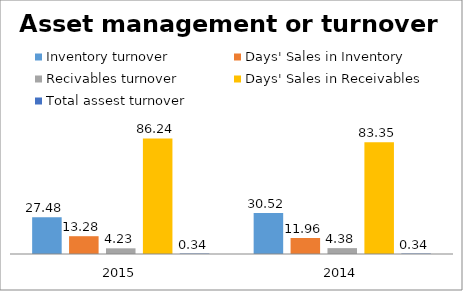
| Category | Inventory turnover  | Days' Sales in Inventory | Recivables turnover  | Days' Sales in Receivables | Total assest turnover  |
|---|---|---|---|---|---|
| 2015.0 | 27.483 | 13.281 | 4.233 | 86.235 | 0.342 |
| 2014.0 | 30.522 | 11.958 | 4.379 | 83.353 | 0.339 |